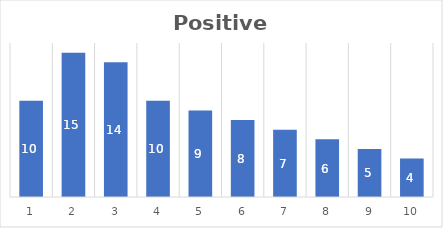
| Category | Series 0 |
|---|---|
| 0 | 10 |
| 1 | 15 |
| 2 | 14 |
| 3 | 10 |
| 4 | 9 |
| 5 | 8 |
| 6 | 7 |
| 7 | 6 |
| 8 | 5 |
| 9 | 4 |